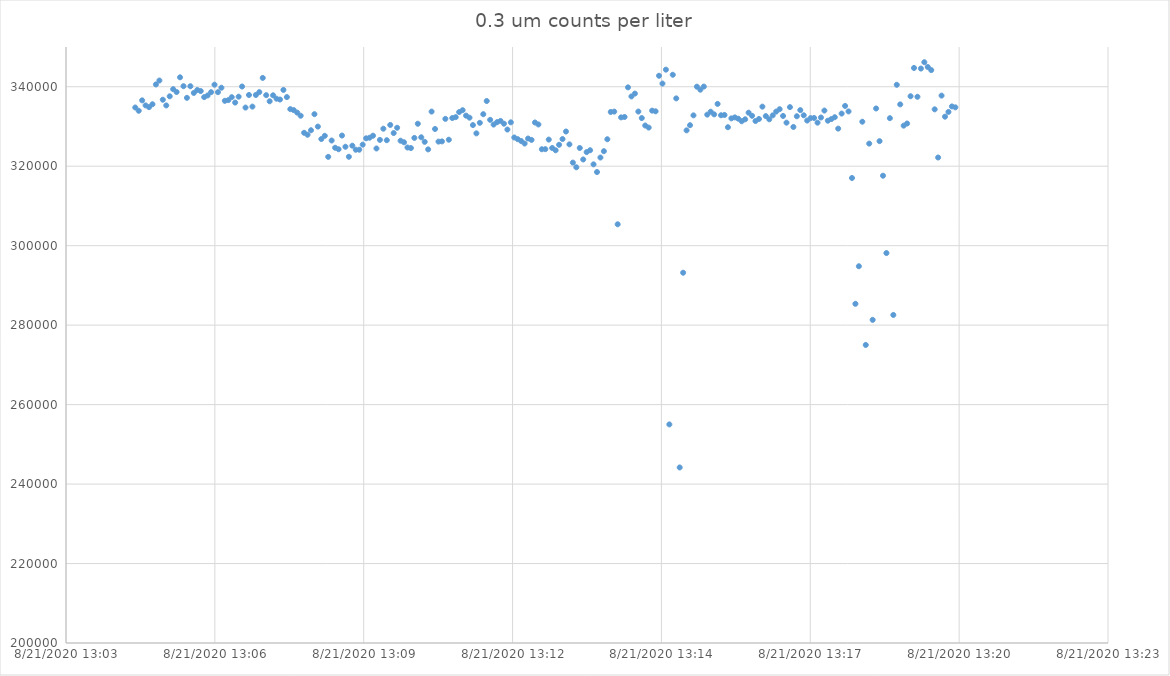
| Category | Series 0 |
|---|---|
| 44064.54493055555 | 334772 |
| 44064.54497685185 | 333952 |
| 44064.545023148145 | 336573 |
| 44064.545069444444 | 335302 |
| 44064.545115740744 | 334864 |
| 44064.54516203704 | 335591 |
| 44064.54520833334 | 340579 |
| 44064.54525462963 | 341561 |
| 44064.54530092593 | 336729 |
| 44064.54534722222 | 335294 |
| 44064.54539351852 | 337590 |
| 44064.545439814814 | 339392 |
| 44064.545486111114 | 338678 |
| 44064.54553240741 | 342373 |
| 44064.545578703706 | 340134 |
| 44064.545625 | 337202 |
| 44064.5456712963 | 340127 |
| 44064.54571759259 | 338438 |
| 44064.54576388889 | 339180 |
| 44064.545810185184 | 338912 |
| 44064.54585648148 | 337386 |
| 44064.545902777776 | 337802 |
| 44064.545949074076 | 338629 |
| 44064.54599537037 | 340515 |
| 44064.54604166667 | 338629 |
| 44064.54608796296 | 339752 |
| 44064.54613425926 | 336453 |
| 44064.54618055555 | 336630 |
| 44064.54622685185 | 337371 |
| 44064.546273148146 | 336015 |
| 44064.546319444446 | 337499 |
| 44064.54636574074 | 340056 |
| 44064.54641203704 | 334758 |
| 44064.54645833333 | 337923 |
| 44064.54650462963 | 334998 |
| 44064.54655092592 | 337923 |
| 44064.54659722222 | 338643 |
| 44064.546643518515 | 342218 |
| 44064.546689814815 | 337880 |
| 44064.54673611111 | 336340 |
| 44064.54678240741 | 337845 |
| 44064.5468287037 | 336990 |
| 44064.546875 | 336778 |
| 44064.5469212963 | 339194 |
| 44064.54696759259 | 337393 |
| 44064.54701388889 | 334362 |
| 44064.547060185185 | 334115 |
| 44064.547106481485 | 333486 |
| 44064.54715277778 | 332702 |
| 44064.54719907408 | 328406 |
| 44064.54724537037 | 327919 |
| 44064.54729166667 | 329049 |
| 44064.54733796296 | 333097 |
| 44064.54738425926 | 329968 |
| 44064.547430555554 | 326838 |
| 44064.547476851854 | 327643 |
| 44064.54752314815 | 322352 |
| 44064.54756944445 | 326464 |
| 44064.54761574074 | 324641 |
| 44064.54766203704 | 324267 |
| 44064.54770833333 | 327714 |
| 44064.54775462963 | 324895 |
| 44064.547800925924 | 322373 |
| 44064.547847222224 | 325164 |
| 44064.54789351852 | 324139 |
| 44064.547939814816 | 324146 |
| 44064.54798611111 | 325425 |
| 44064.54803240741 | 327022 |
| 44064.5480787037 | 327170 |
| 44064.548125 | 327672 |
| 44064.548171296294 | 324464 |
| 44064.54821759259 | 326619 |
| 44064.548263888886 | 329438 |
| 44064.548310185186 | 326541 |
| 44064.54835648148 | 330385 |
| 44064.54840277778 | 328343 |
| 44064.54844907407 | 329671 |
| 44064.54849537037 | 326414 |
| 44064.54854166666 | 326019 |
| 44064.54858796296 | 324705 |
| 44064.548634259256 | 324570 |
| 44064.548680555556 | 327121 |
| 44064.548726851855 | 330681 |
| 44064.54877314815 | 327276 |
| 44064.54881944445 | 326132 |
| 44064.54886574074 | 324231 |
| 44064.54891203704 | 333747 |
| 44064.54895833333 | 329367 |
| 44064.54900462963 | 326188 |
| 44064.549050925925 | 326238 |
| 44064.549097222225 | 331918 |
| 44064.54914351852 | 326661 |
| 44064.54918981482 | 332122 |
| 44064.54923611111 | 332341 |
| 44064.54928240741 | 333627 |
| 44064.5493287037 | 334093 |
| 44064.549375 | 332723 |
| 44064.549421296295 | 332214 |
| 44064.549467592595 | 330356 |
| 44064.54951388889 | 328265 |
| 44064.54956018519 | 330914 |
| 44064.54960648148 | 333090 |
| 44064.54965277778 | 336404 |
| 44064.54969907407 | 331663 |
| 44064.54974537037 | 330476 |
| 44064.549791666665 | 331084 |
| 44064.549837962964 | 331395 |
| 44064.54988425926 | 330695 |
| 44064.54993055556 | 329226 |
| 44064.54997685185 | 331042 |
| 44064.55002314815 | 327227 |
| 44064.55006944444 | 326803 |
| 44064.55011574074 | 326329 |
| 44064.550162037034 | 325708 |
| 44064.550208333334 | 326965 |
| 44064.55025462963 | 326619 |
| 44064.55030092593 | 330999 |
| 44064.55034722222 | 330505 |
| 44064.55039351852 | 324267 |
| 44064.55043981481 | 324288 |
| 44064.55048611111 | 326697 |
| 44064.550532407404 | 324577 |
| 44064.550578703704 | 324005 |
| 44064.550625 | 325390 |
| 44064.550671296296 | 326831 |
| 44064.550717592596 | 328731 |
| 44064.55076388889 | 325496 |
| 44064.55081018519 | 320904 |
| 44064.55085648148 | 319731 |
| 44064.55090277778 | 324584 |
| 44064.55094907407 | 321695 |
| 44064.55099537037 | 323553 |
| 44064.551041666666 | 324019 |
| 44064.551087962966 | 320466 |
| 44064.55113425926 | 318530 |
| 44064.55118055556 | 322182 |
| 44064.55122685185 | 323779 |
| 44064.55127314815 | 326782 |
| 44064.55131944444 | 333648 |
| 44064.55136574074 | 333740 |
| 44064.551412037035 | 305383 |
| 44064.551458333335 | 332285 |
| 44064.55150462963 | 332391 |
| 44064.55155092593 | 339844 |
| 44064.55159722222 | 337562 |
| 44064.55164351852 | 338276 |
| 44064.55168981481 | 333754 |
| 44064.55173611111 | 332115 |
| 44064.551782407405 | 330236 |
| 44064.551828703705 | 329720 |
| 44064.551875 | 333980 |
| 44064.5519212963 | 333811 |
| 44064.55196759259 | 342762 |
| 44064.55201388889 | 340798 |
| 44064.55206018518 | 344295 |
| 44064.55210648148 | 255012 |
| 44064.552152777775 | 343009 |
| 44064.552199074074 | 337068 |
| 44064.55224537037 | 244182 |
| 44064.55229166667 | 293189 |
| 44064.55233796296 | 329021 |
| 44064.55238425926 | 330321 |
| 44064.55243055556 | 332794 |
| 44064.55247685185 | 340007 |
| 44064.55252314815 | 339251 |
| 44064.552569444444 | 340042 |
| 44064.552615740744 | 332977 |
| 44064.55266203704 | 333712 |
| 44064.552708333336 | 333048 |
| 44064.55275462963 | 335676 |
| 44064.55280092593 | 332822 |
| 44064.55284722222 | 332892 |
| 44064.55289351852 | 329812 |
| 44064.552939814814 | 332038 |
| 44064.55298611111 | 332285 |
| 44064.553032407406 | 331953 |
| 44064.553078703706 | 331317 |
| 44064.553125 | 331805 |
| 44064.5531712963 | 333472 |
| 44064.55321759259 | 332688 |
| 44064.55326388889 | 331374 |
| 44064.55331018518 | 331882 |
| 44064.55335648148 | 334991 |
| 44064.553402777776 | 332610 |
| 44064.553449074076 | 331805 |
| 44064.55349537037 | 332794 |
| 44064.55354166667 | 333740 |
| 44064.55358796296 | 334341 |
| 44064.55363425926 | 332645 |
| 44064.55368055555 | 330957 |
| 44064.55372685185 | 334871 |
| 44064.553773148145 | 329876 |
| 44064.553819444445 | 332575 |
| 44064.55386574074 | 334115 |
| 44064.55391203704 | 332815 |
| 44064.55395833333 | 331487 |
| 44064.55400462963 | 332101 |
| 44064.55405092592 | 332137 |
| 44064.55409722222 | 330957 |
| 44064.554143518515 | 332250 |
| 44064.554189814815 | 334002 |
| 44064.554236111115 | 331451 |
| 44064.55428240741 | 331854 |
| 44064.55432870371 | 332327 |
| 44064.554375 | 329459 |
| 44064.5544212963 | 333246 |
| 44064.55446759259 | 335167 |
| 44064.55451388889 | 333783 |
| 44064.554560185185 | 317032 |
| 44064.554606481484 | 285369 |
| 44064.55465277778 | 294821 |
| 44064.55469907408 | 331197 |
| 44064.55474537037 | 275012 |
| 44064.55479166667 | 325687 |
| 44064.55483796296 | 281328 |
| 44064.55488425926 | 334531 |
| 44064.554930555554 | 326308 |
| 44064.554976851854 | 317605 |
| 44064.55502314815 | 298142 |
| 44064.55506944445 | 332087 |
| 44064.55511574074 | 282564 |
| 44064.55516203704 | 340487 |
| 44064.55520833333 | 335556 |
| 44064.55525462963 | 330208 |
| 44064.555300925924 | 330745 |
| 44064.555347222224 | 337605 |
| 44064.555393518516 | 344726 |
| 44064.555439814816 | 337470 |
| 44064.55548611111 | 344577 |
| 44064.55553240741 | 346167 |
| 44064.5555787037 | 344966 |
| 44064.555625 | 344189 |
| 44064.55567129629 | 334312 |
| 44064.55571759259 | 322190 |
| 44064.555763888886 | 337767 |
| 44064.555810185186 | 332469 |
| 44064.55585648148 | 333663 |
| 44064.55590277778 | 335040 |
| 44064.55594907407 | 334814 |